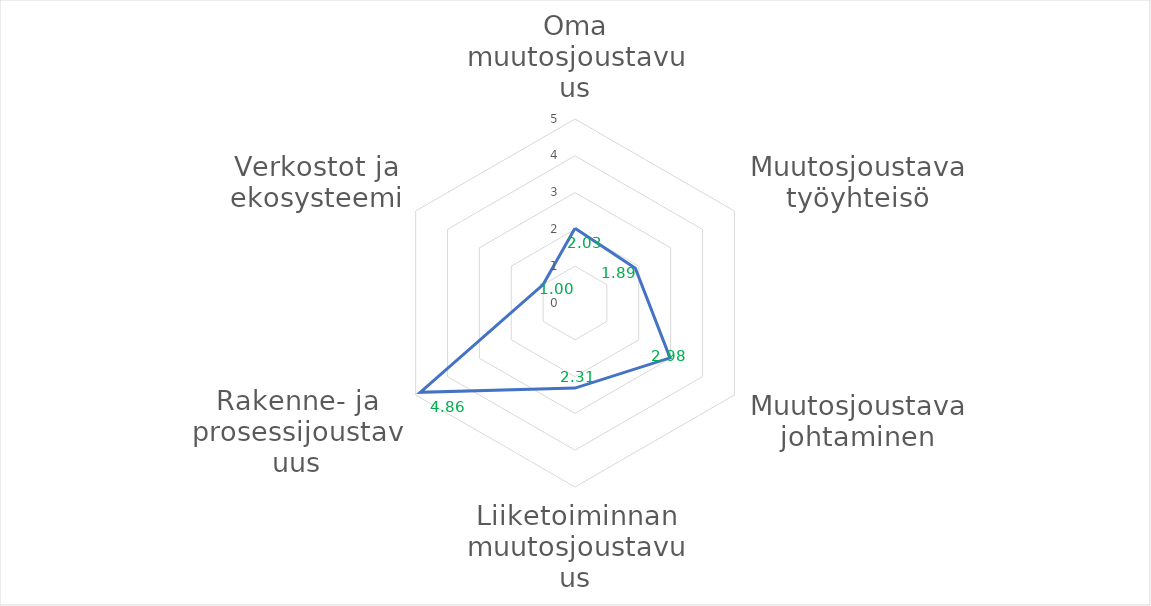
| Category | Series 0 |
|---|---|
| Oma muutosjoustavuus | 2.032 |
| Muutosjoustava työyhteisö | 1.893 |
| Muutosjoustava johtaminen | 2.982 |
| Liiketoiminnan muutosjoustavuus | 2.312 |
| Rakenne- ja prosessijoustavuus | 4.857 |
| Verkostot ja ekosysteemi | 1 |